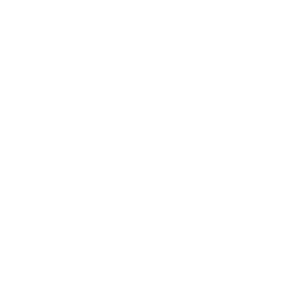
| Category | Series 0 |
|---|---|
| Large & Mid Cap | 0 |
| Small Cap | 0 |
| Int'l Developed | 0 |
| Int'l Emerging | 0 |
| Intermediate Bond | 0 |
| Short-Term Bond | 0 |
| International Bond | 0 |